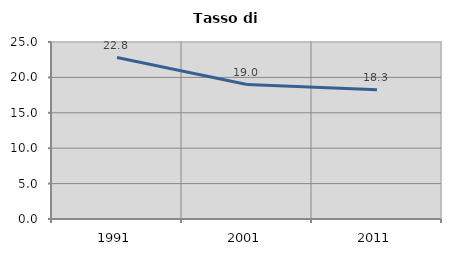
| Category | Tasso di disoccupazione   |
|---|---|
| 1991.0 | 22.804 |
| 2001.0 | 18.991 |
| 2011.0 | 18.258 |